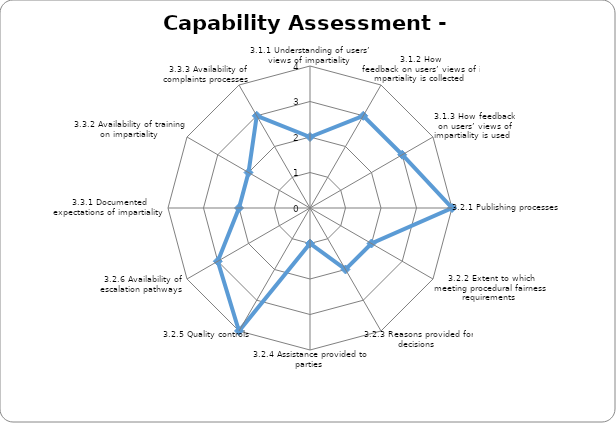
| Category | Series 0 |
|---|---|
| 3.1.1 Understanding of users’ views of impartiality  | 2 |
| 3.1.2 How feedback on users’ views of impartiality is collected  | 3 |
| 3.1.3 How feedback on users’ views of impartiality is used  | 3 |
| 3.2.1 Publishing processes  | 4 |
| 3.2.2 Extent to which meeting procedural fairness requirements  | 2 |
| 3.2.3 Reasons provided for decisions  | 2 |
| 3.2.4 Assistance provided to parties  | 1 |
| 3.2.5 Quality controls | 4 |
| 3.2.6 Availability of escalation pathways  | 3 |
| 3.3.1 Documented expectations of impartiality  | 2 |
| 3.3.2 Availability of training on impartiality | 2 |
| 3.3.3 Availability of complaints processes  | 3 |